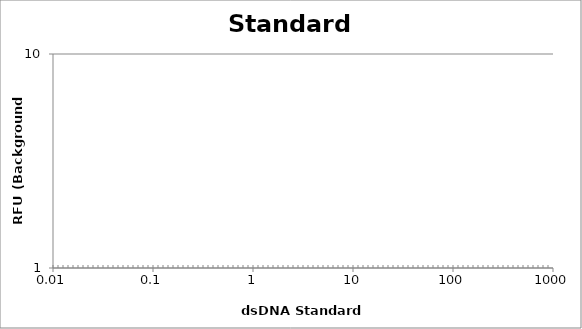
| Category | Average |
|---|---|
| 200.0 | 0 |
| 50.0 | 0 |
| 12.5 | 0 |
| 3.125 | 0 |
| 0.78125 | 0 |
| 0.1953125 | 0 |
| 0.048828125 | 0 |